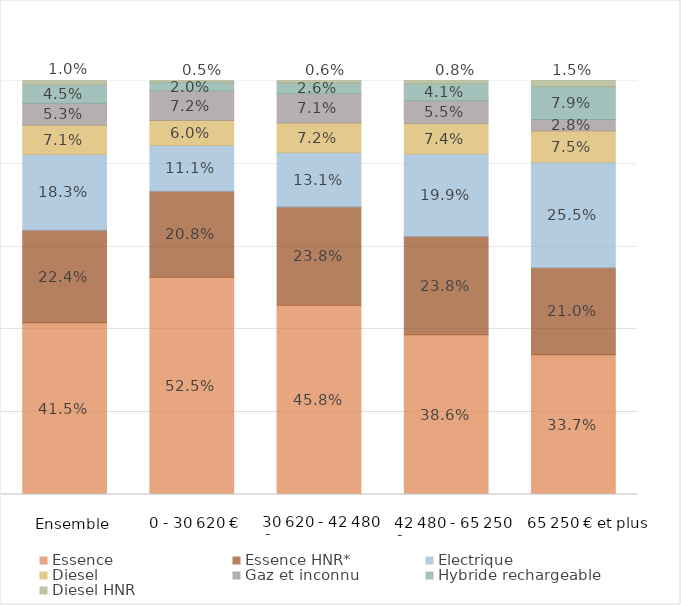
| Category | Essence | Essence HNR* | Électrique | Diesel | Gaz et inconnu | Hybride rechargeable | Diesel HNR |
|---|---|---|---|---|---|---|---|
|  | 0.415 | 0.224 | 0.183 | 0.071 | 0.053 | 0.045 | 0.01 |
|  | 0.525 | 0.208 | 0.111 | 0.06 | 0.072 | 0.02 | 0.005 |
|  | 0.458 | 0.238 | 0.131 | 0.072 | 0.071 | 0.026 | 0.006 |
|  | 0.386 | 0.238 | 0.199 | 0.074 | 0.055 | 0.041 | 0.008 |
|  | 0.337 | 0.21 | 0.255 | 0.075 | 0.028 | 0.079 | 0.015 |